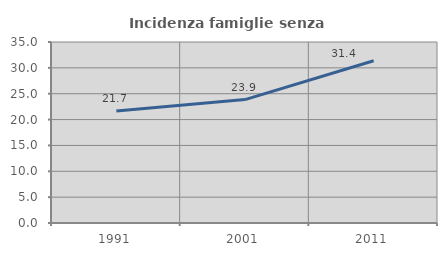
| Category | Incidenza famiglie senza nuclei |
|---|---|
| 1991.0 | 21.659 |
| 2001.0 | 23.864 |
| 2011.0 | 31.371 |